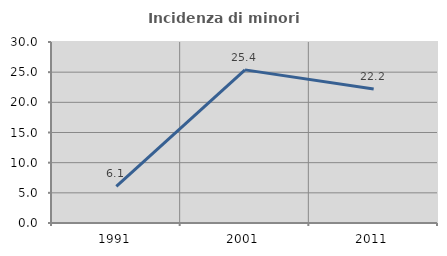
| Category | Incidenza di minori stranieri |
|---|---|
| 1991.0 | 6.061 |
| 2001.0 | 25.381 |
| 2011.0 | 22.2 |